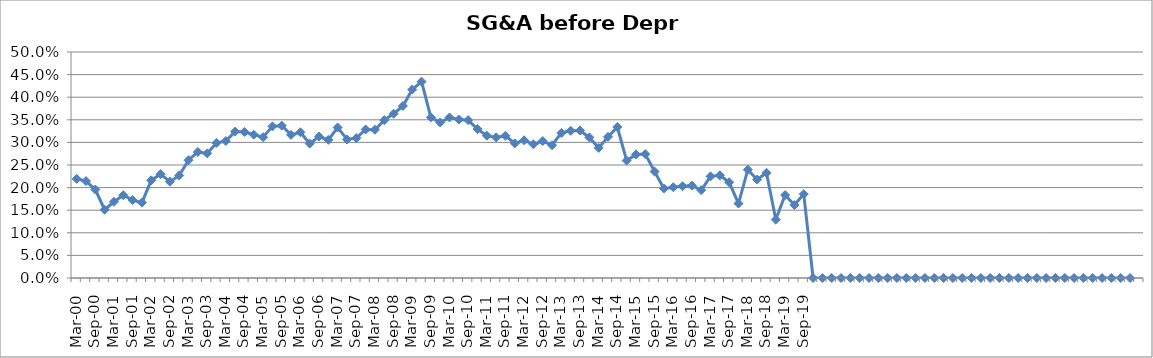
| Category | SG&A (before depr.) % |
|---|---|
| Mar-00 | 0.219 |
| Jun-00 | 0.215 |
| Sep-00 | 0.196 |
| Dec-00 | 0.151 |
| Mar-01 | 0.169 |
| Jun-01 | 0.183 |
| Sep-01 | 0.172 |
| Dec-01 | 0.167 |
| Mar-02 | 0.216 |
| Jun-02 | 0.23 |
| Sep-02 | 0.213 |
| Dec-02 | 0.227 |
| Mar-03 | 0.261 |
| Jun-03 | 0.279 |
| Sep-03 | 0.276 |
| Dec-03 | 0.299 |
| Mar-04 | 0.303 |
| Jun-04 | 0.324 |
| Sep-04 | 0.323 |
| Dec-04 | 0.317 |
| Mar-05 | 0.312 |
| Jun-05 | 0.335 |
| Sep-05 | 0.337 |
| Dec-05 | 0.317 |
| Mar-06 | 0.322 |
| Jun-06 | 0.297 |
| Sep-06 | 0.313 |
| Dec-06 | 0.306 |
| Mar-07 | 0.333 |
| Jun-07 | 0.306 |
| Sep-07 | 0.31 |
| Dec-07 | 0.329 |
| Mar-08 | 0.328 |
| Jun-08 | 0.349 |
| Sep-08 | 0.363 |
| Dec-08 | 0.381 |
| Mar-09 | 0.417 |
| Jun-09 | 0.434 |
| Sep-09 | 0.355 |
| Dec-09 | 0.344 |
| Mar-10 | 0.355 |
| Jun-10 | 0.351 |
| Sep-10 | 0.349 |
| Dec-10 | 0.33 |
| Mar-11 | 0.315 |
| Jun-11 | 0.311 |
| Sep-11 | 0.315 |
| Dec-11 | 0.298 |
| Mar-12 | 0.305 |
| Jun-12 | 0.296 |
| Sep-12 | 0.303 |
| Dec-12 | 0.294 |
| Mar-13 | 0.321 |
| Jun-13 | 0.326 |
| Sep-13 | 0.326 |
| Dec-13 | 0.311 |
| Mar-14 | 0.288 |
| Jun-14 | 0.312 |
| Sep-14 | 0.334 |
| Dec-14 | 0.26 |
| Mar-15 | 0.273 |
| Jun-15 | 0.274 |
| Sep-15 | 0.235 |
| Dec-15 | 0.198 |
| Mar-16 | 0.201 |
| Jun-16 | 0.203 |
| Sep-16 | 0.204 |
| Dec-16 | 0.194 |
| Mar-17 | 0.225 |
| Jun-17 | 0.227 |
| Sep-17 | 0.212 |
| Dec-17 | 0.165 |
| Mar-18 | 0.24 |
| Jun-18 | 0.218 |
| Sep-18 | 0.233 |
| Dec-18 | 0.129 |
| Mar-19 | 0.184 |
| Jun-19 | 0.161 |
| Sep-19 | 0.186 |